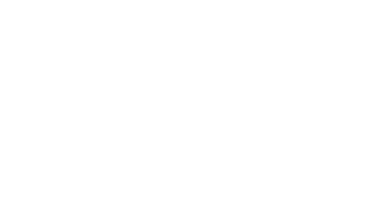
| Category | Series 0 | Series 1 | Series 2 |
|---|---|---|---|
| SEARCH CAPABILITY | 0 | 0 | 0 |
| DOC MGMT CAPABILITY | 0 | 0 | 0 |
| FILE STORAGE + NETWORK ACCESS | 0 | 0 | 0 |
| OTHER | 0 | 0 | 0 |
| OTHER | 0 | 0 | 0 |
| OTHER | 0 | 0 | 0 |